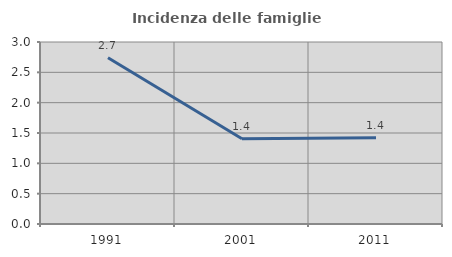
| Category | Incidenza delle famiglie numerose |
|---|---|
| 1991.0 | 2.74 |
| 2001.0 | 1.405 |
| 2011.0 | 1.42 |